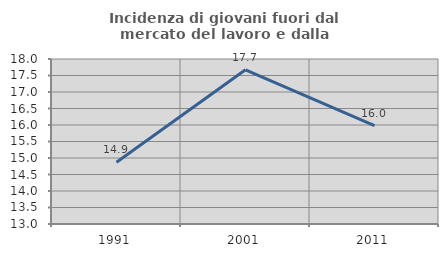
| Category | Incidenza di giovani fuori dal mercato del lavoro e dalla formazione  |
|---|---|
| 1991.0 | 14.87 |
| 2001.0 | 17.672 |
| 2011.0 | 15.982 |